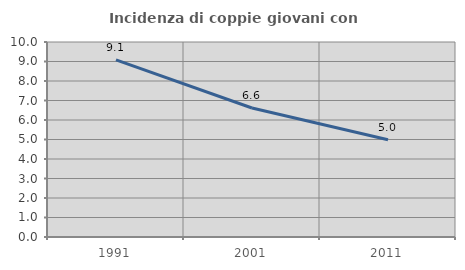
| Category | Incidenza di coppie giovani con figli |
|---|---|
| 1991.0 | 9.081 |
| 2001.0 | 6.617 |
| 2011.0 | 4.991 |